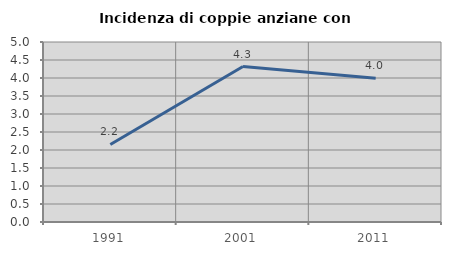
| Category | Incidenza di coppie anziane con figli |
|---|---|
| 1991.0 | 2.153 |
| 2001.0 | 4.318 |
| 2011.0 | 3.99 |